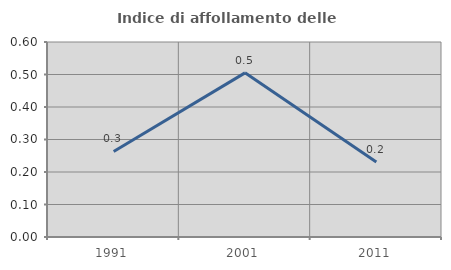
| Category | Indice di affollamento delle abitazioni  |
|---|---|
| 1991.0 | 0.263 |
| 2001.0 | 0.505 |
| 2011.0 | 0.23 |